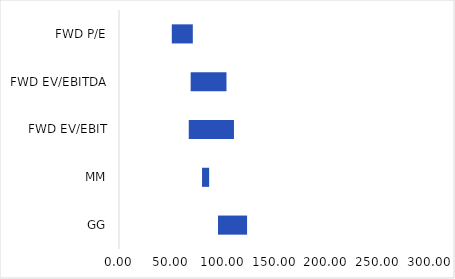
| Category | Series 0 | Series 1 | Series 2 |
|---|---|---|---|
| GG | 95.483 | 28.062 | 123.545 |
| MM | 80.091 | 6.873 | 86.964 |
| FWD EV/EBIT | 67.302 | 43.583 | 110.885 |
| FWD EV/EBITDA | 69.122 | 34.556 | 103.679 |
| FWD P/E | 50.923 | 20.287 | 71.21 |